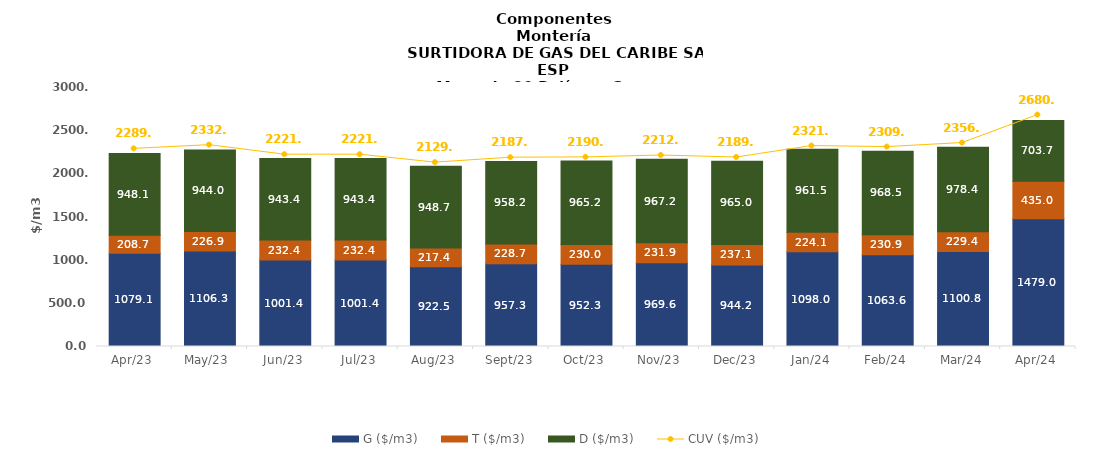
| Category | G ($/m3) | T ($/m3) | D ($/m3) |
|---|---|---|---|
| 2023-04-01 | 1079.14 | 208.7 | 948.13 |
| 2023-05-01 | 1106.33 | 226.94 | 944.03 |
| 2023-06-01 | 1001.4 | 232.37 | 943.37 |
| 2023-07-01 | 1001.4 | 232.37 | 943.37 |
| 2023-08-01 | 922.47 | 217.36 | 948.72 |
| 2023-09-01 | 957.29 | 228.69 | 958.18 |
| 2023-10-01 | 952.33 | 230.03 | 965.19 |
| 2023-11-01 | 969.64 | 231.88 | 967.17 |
| 2023-12-01 | 944.16 | 237.1 | 964.97 |
| 2024-01-01 | 1097.97 | 224.12 | 961.47 |
| 2024-02-01 | 1063.61 | 230.85 | 968.52 |
| 2024-03-01 | 1100.75 | 229.35 | 978.39 |
| 2024-04-01 | 1479 | 435 | 703.7 |